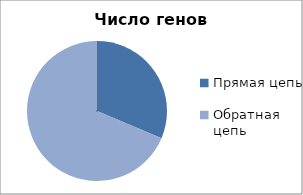
| Category | Series 0 |
|---|---|
| Прямая цепь  | 21 |
| Обратная цепь | 46 |